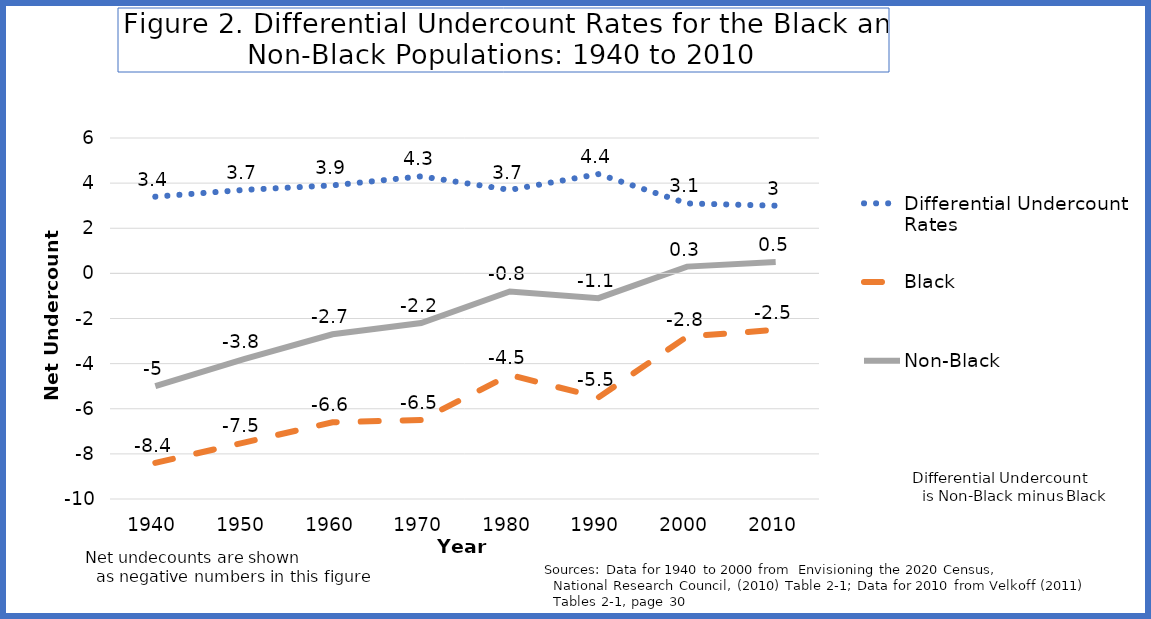
| Category | Differential Undercount Rates  | Black  | Non-Black  |
|---|---|---|---|
| 1940.0 | 3.4 | -8.4 | -5 |
| 1950.0 | 3.7 | -7.5 | -3.8 |
| 1960.0 | 3.9 | -6.6 | -2.7 |
| 1970.0 | 4.3 | -6.5 | -2.2 |
| 1980.0 | 3.7 | -4.5 | -0.8 |
| 1990.0 | 4.4 | -5.5 | -1.1 |
| 2000.0 | 3.1 | -2.8 | 0.3 |
| 2010.0 | 3 | -2.5 | 0.5 |